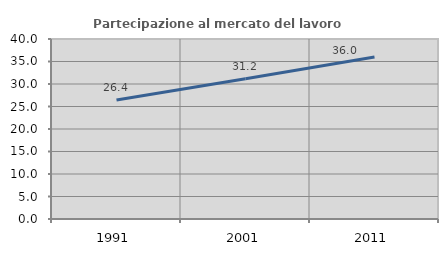
| Category | Partecipazione al mercato del lavoro  femminile |
|---|---|
| 1991.0 | 26.424 |
| 2001.0 | 31.169 |
| 2011.0 | 35.99 |